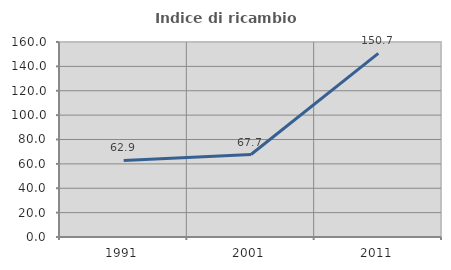
| Category | Indice di ricambio occupazionale  |
|---|---|
| 1991.0 | 62.866 |
| 2001.0 | 67.683 |
| 2011.0 | 150.661 |